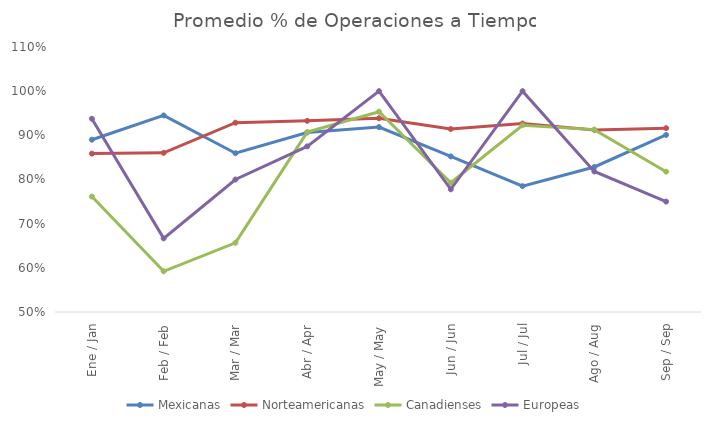
| Category | Mexicanas | Norteamericanas | Canadienses | Europeas |
|---|---|---|---|---|
| Ene / Jan | 0.89 | 0.859 | 0.761 | 0.938 |
| Feb / Feb | 0.945 | 0.86 | 0.592 | 0.667 |
| Mar / Mar | 0.859 | 0.929 | 0.657 | 0.8 |
| Abr / Apr | 0.906 | 0.933 | 0.907 | 0.875 |
| May / May | 0.919 | 0.939 | 0.954 | 1 |
| Jun / Jun | 0.852 | 0.914 | 0.793 | 0.778 |
| Jul / Jul | 0.785 | 0.927 | 0.923 | 1 |
| Ago / Aug | 0.828 | 0.912 | 0.913 | 0.818 |
| Sep / Sep | 0.901 | 0.916 | 0.818 | 0.75 |